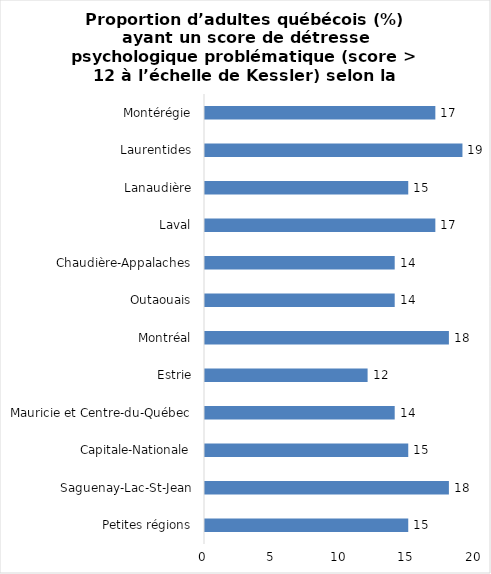
| Category | Series 0 |
|---|---|
| Petites régions | 15 |
| Saguenay-Lac-St-Jean | 18 |
| Capitale-Nationale | 15 |
| Mauricie et Centre-du-Québec | 14 |
| Estrie | 12 |
| Montréal | 18 |
| Outaouais | 14 |
| Chaudière-Appalaches | 14 |
| Laval | 17 |
| Lanaudière | 15 |
| Laurentides | 19 |
| Montérégie | 17 |